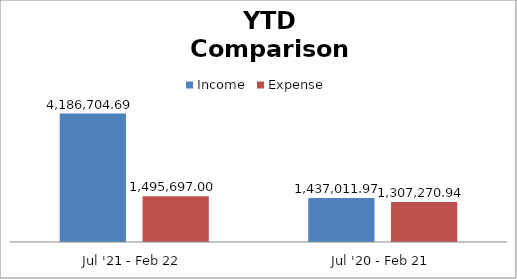
| Category | Income | Expense |
|---|---|---|
| Jul '21 - Feb 22 | 4186704.69 | 1495697 |
| Jul '20 - Feb 21 | 1437011.97 | 1307270.94 |